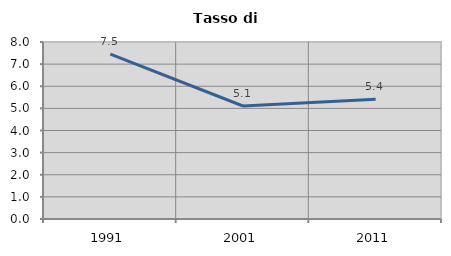
| Category | Tasso di disoccupazione   |
|---|---|
| 1991.0 | 7.451 |
| 2001.0 | 5.106 |
| 2011.0 | 5.408 |